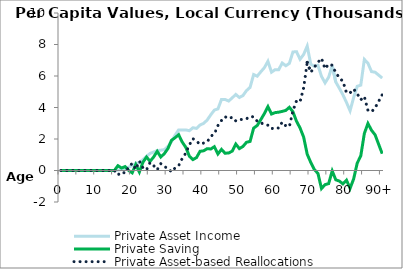
| Category | Private Asset Income | Private Saving | Private Asset-based Reallocations |
|---|---|---|---|
| 0 | 0 | -0.171 | 0.171 |
|  | 0 | -0.174 | 0.174 |
| 2 | 0 | -0.177 | 0.177 |
| 3 | 0 | -0.17 | 0.17 |
| 4 | 0 | 0.163 | -0.163 |
| 5 | 0 | 0.178 | -0.178 |
| 6 | 0 | 0.023 | -0.023 |
| 7 | 0 | 0.314 | -0.314 |
| 8 | 0 | 0.019 | -0.019 |
| 9 | 0 | 0.013 | -0.013 |
| 10 | 0 | 0.064 | -0.064 |
| 11 | 0 | 0.219 | -0.219 |
| 12 | 0 | 0.029 | -0.029 |
| 13 | 0 | 0.27 | -0.27 |
| 14 | 0 | 0.287 | -0.287 |
| 15 | 0 | -0.176 | 0.176 |
| 16 | 24.823 | 304.105 | -279.282 |
| 17 | 58.113 | 155.953 | -97.839 |
| 18 | 89.704 | 247.673 | -157.969 |
| 19 | 215.197 | 1.391 | 213.806 |
| 20 | 306.777 | -148.774 | 455.55 |
| 21 | 456.069 | 381.827 | 74.242 |
| 22 | 494.462 | -99.549 | 594.01 |
| 23 | 693.645 | 519.916 | 173.729 |
| 24 | 891.281 | 854.254 | 37.027 |
| 25 | 1084.861 | 580.936 | 503.925 |
| 26 | 1170.56 | 858.352 | 312.209 |
| 27 | 1262.167 | 1215.105 | 47.062 |
| 28 | 1291.054 | 856.873 | 434.181 |
| 29 | 1322.026 | 1073.147 | 248.879 |
| 30 | 1529.752 | 1394.205 | 135.547 |
| 31 | 1828.757 | 1916.763 | -88.006 |
| 32 | 2241.291 | 2081.096 | 160.195 |
| 33 | 2575.837 | 2271.633 | 304.204 |
| 34 | 2572.884 | 1807.03 | 765.854 |
| 35 | 2573.814 | 1474.243 | 1099.571 |
| 36 | 2527.124 | 905.14 | 1621.984 |
| 37 | 2714.507 | 692.236 | 2022.271 |
| 38 | 2672.883 | 820.086 | 1852.798 |
| 39 | 2887.799 | 1219.618 | 1668.181 |
| 40 | 2993.804 | 1250.057 | 1743.747 |
| 41 | 3205.684 | 1387.206 | 1818.478 |
| 42 | 3538.145 | 1365.515 | 2172.631 |
| 43 | 3833.496 | 1511.418 | 2322.078 |
| 44 | 3908.545 | 1052.091 | 2856.454 |
| 45 | 4514.121 | 1340.337 | 3173.784 |
| 46 | 4511.342 | 1095.566 | 3415.775 |
| 47 | 4409.976 | 1114.673 | 3295.303 |
| 48 | 4611.71 | 1228.446 | 3383.264 |
| 49 | 4829.012 | 1679.7 | 3149.312 |
| 50 | 4636.815 | 1390.784 | 3246.03 |
| 51 | 4757.147 | 1524.358 | 3232.789 |
| 52 | 5074.037 | 1791.827 | 3282.211 |
| 53 | 5278.069 | 1845.344 | 3432.724 |
| 54 | 6092.496 | 2689.517 | 3402.98 |
| 55 | 5987.443 | 2858.153 | 3129.29 |
| 56 | 6266.266 | 3227.459 | 3038.806 |
| 57 | 6526.888 | 3613.642 | 2913.245 |
| 58 | 6933.241 | 4055.658 | 2877.582 |
| 59 | 6240.886 | 3586.276 | 2654.61 |
| 60 | 6401.107 | 3674.606 | 2726.502 |
| 61 | 6396.253 | 3703.119 | 2693.134 |
| 62 | 6824.211 | 3753.179 | 3071.032 |
| 63 | 6652.23 | 3814.839 | 2837.391 |
| 64 | 6800.83 | 4011.975 | 2788.855 |
| 65 | 7525.378 | 3731.767 | 3793.61 |
| 66 | 7544.249 | 3127.947 | 4416.301 |
| 67 | 7064.594 | 2698.64 | 4365.954 |
| 68 | 7366.879 | 2120.804 | 5246.076 |
| 69 | 7897.024 | 1033.985 | 6863.039 |
| 70 | 6747.361 | 508.655 | 6238.706 |
| 71 | 6617.424 | 58.867 | 6558.557 |
| 72 | 6682.191 | -183.549 | 6865.74 |
| 73 | 5977.839 | -1146.16 | 7123.999 |
| 74 | 5563.545 | -897.073 | 6460.618 |
| 75 | 5920.482 | -832.376 | 6752.858 |
| 76 | 6653.954 | -30.631 | 6684.585 |
| 77 | 5614.965 | -591.933 | 6206.897 |
| 78 | 5221.296 | -671.006 | 5892.302 |
| 79 | 4804.318 | -851.703 | 5656.021 |
| 80 | 4318.836 | -613.512 | 4932.348 |
| 81 | 3792.43 | -1135.785 | 4928.215 |
| 82 | 4632.263 | -534.941 | 5167.204 |
| 83 | 5343.913 | 468.221 | 4875.692 |
| 84 | 5418.662 | 930.807 | 4487.855 |
| 85 | 7050.727 | 2354.184 | 4696.543 |
| 86 | 6812.49 | 2985.03 | 3827.461 |
| 87 | 6279.934 | 2553.109 | 3726.825 |
| 88 | 6241.942 | 2267.607 | 3974.336 |
| 89 | 6056.43 | 1665.633 | 4390.797 |
| 90+ | 5870.917 | 1066.16 | 4804.757 |